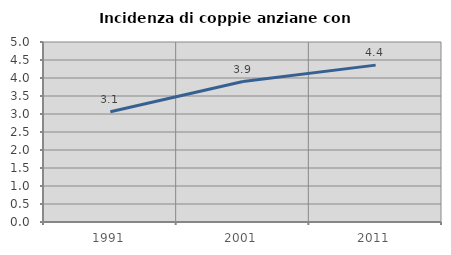
| Category | Incidenza di coppie anziane con figli |
|---|---|
| 1991.0 | 3.061 |
| 2001.0 | 3.901 |
| 2011.0 | 4.358 |